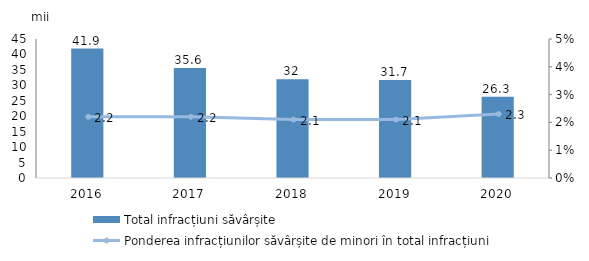
| Category | Total infracțiuni săvârșite |
|---|---|
| 2016.0 | 41.9 |
| 2017.0 | 35.6 |
| 2018.0 | 32 |
| 2019.0 | 31.7 |
| 2020.0 | 26.3 |